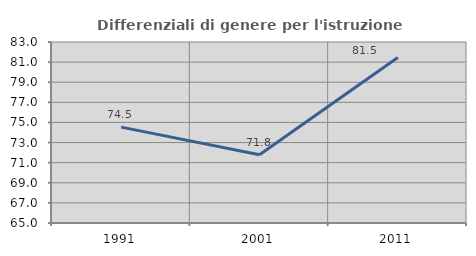
| Category | Differenziali di genere per l'istruzione superiore |
|---|---|
| 1991.0 | 74.535 |
| 2001.0 | 71.79 |
| 2011.0 | 81.463 |